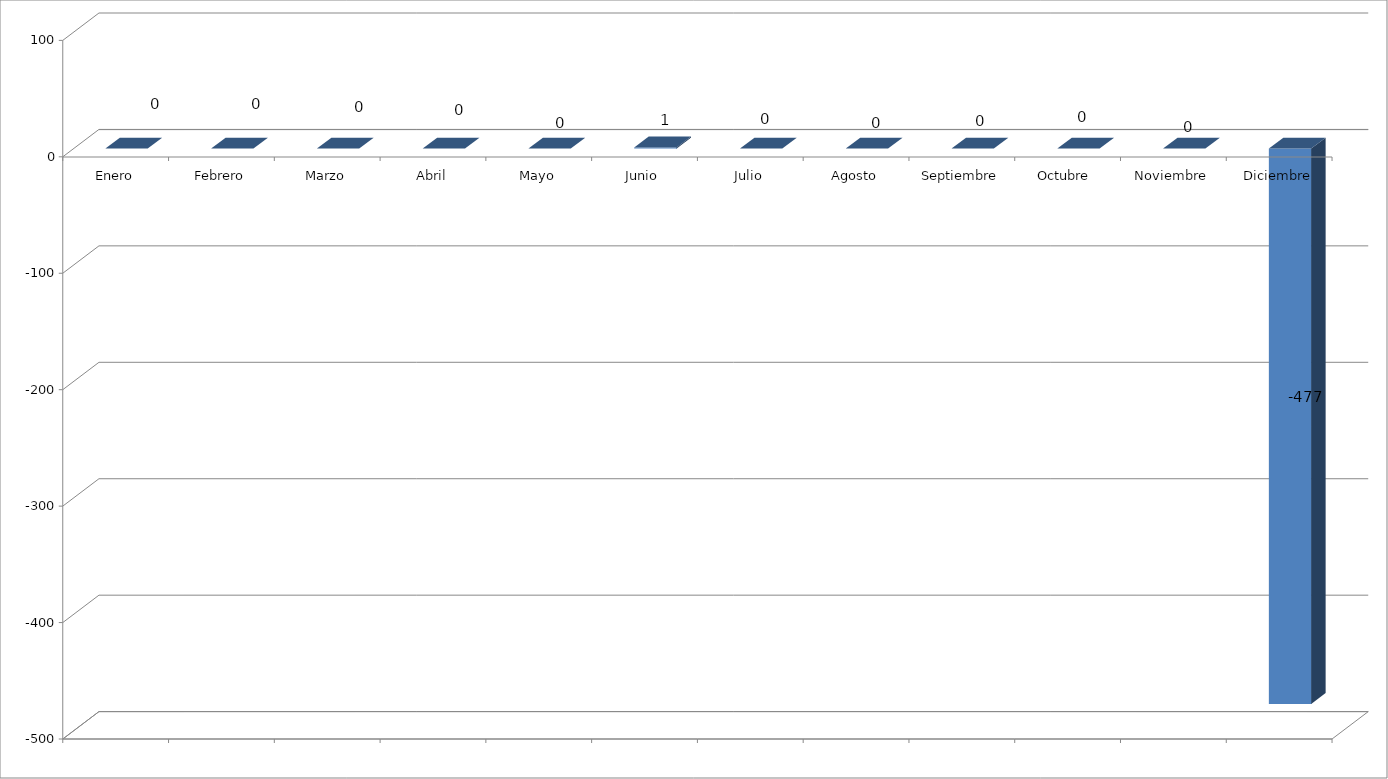
| Category | Series 0 |
|---|---|
| Enero | 0 |
| Febrero | 0 |
| Marzo | 0 |
| Abril | 0 |
| Mayo | 0 |
| Junio  | 1 |
| Julio | 0 |
| Agosto | 0 |
| Septiembre | 0 |
| Octubre  | 0 |
| Noviembre | 0 |
| Diciembre | -477 |